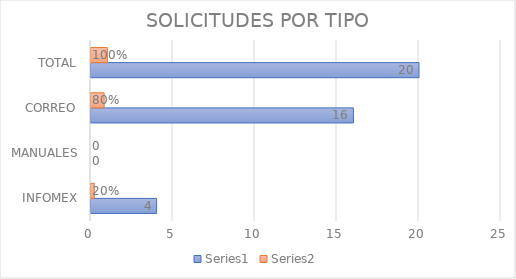
| Category | Series 0 | Series 1 |
|---|---|---|
| INFOMEX | 4 | 0.2 |
| MANUALES | 0 | 0 |
| CORREO | 16 | 0.8 |
| TOTAL | 20 | 1 |